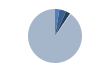
| Category | Series 0 |
|---|---|
| ARRASTRE | 30 |
| CERCO | 47 |
| PALANGRE | 31 |
| REDES DE ENMALLE | 5 |
| ARTES MENORES | 1028 |
| SIN TIPO ASIGNADO | 0 |